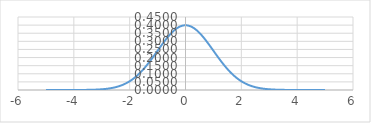
| Category | Series 0 |
|---|---|
| -5.0 | 0 |
| -4.9 | 0 |
| -4.8 | 0 |
| -4.7 | 0 |
| -4.6 | 0 |
| -4.5 | 0 |
| -4.4 | 0 |
| -4.3 | 0 |
| -4.2 | 0 |
| -4.1 | 0 |
| -4.0 | 0 |
| -3.9 | 0 |
| -3.8 | 0 |
| -3.7 | 0 |
| -3.6 | 0.001 |
| -3.50000000000001 | 0.001 |
| -3.40000000000001 | 0.001 |
| -3.30000000000001 | 0.002 |
| -3.20000000000001 | 0.002 |
| -3.10000000000001 | 0.003 |
| -3.00000000000001 | 0.004 |
| -2.90000000000001 | 0.006 |
| -2.80000000000001 | 0.008 |
| -2.70000000000001 | 0.01 |
| -2.60000000000001 | 0.014 |
| -2.50000000000001 | 0.018 |
| -2.40000000000001 | 0.022 |
| -2.30000000000001 | 0.028 |
| -2.20000000000001 | 0.035 |
| -2.10000000000001 | 0.044 |
| -2.00000000000001 | 0.054 |
| -1.90000000000001 | 0.066 |
| -1.80000000000001 | 0.079 |
| -1.70000000000001 | 0.094 |
| -1.60000000000001 | 0.111 |
| -1.50000000000001 | 0.13 |
| -1.40000000000001 | 0.15 |
| -1.30000000000001 | 0.171 |
| -1.20000000000001 | 0.194 |
| -1.10000000000001 | 0.218 |
| -1.00000000000001 | 0.242 |
| -0.90000000000001 | 0.266 |
| -0.80000000000001 | 0.29 |
| -0.70000000000002 | 0.312 |
| -0.60000000000002 | 0.333 |
| -0.50000000000002 | 0.352 |
| -0.40000000000002 | 0.368 |
| -0.30000000000002 | 0.381 |
| -0.20000000000002 | 0.391 |
| -0.10000000000002 | 0.397 |
| -2.04281036531029e-14 | 0.399 |
| 0.0999999999999801 | 0.397 |
| 0.19999999999998 | 0.391 |
| 0.29999999999998 | 0.381 |
| 0.39999999999998 | 0.368 |
| 0.49999999999998 | 0.352 |
| 0.59999999999998 | 0.333 |
| 0.69999999999998 | 0.312 |
| 0.79999999999998 | 0.29 |
| 0.89999999999998 | 0.266 |
| 0.99999999999998 | 0.242 |
| 1.09999999999998 | 0.218 |
| 1.19999999999998 | 0.194 |
| 1.29999999999998 | 0.171 |
| 1.39999999999998 | 0.15 |
| 1.49999999999998 | 0.13 |
| 1.59999999999998 | 0.111 |
| 1.69999999999998 | 0.094 |
| 1.79999999999998 | 0.079 |
| 1.89999999999998 | 0.066 |
| 1.99999999999998 | 0.054 |
| 2.09999999999997 | 0.044 |
| 2.19999999999997 | 0.035 |
| 2.29999999999997 | 0.028 |
| 2.39999999999997 | 0.022 |
| 2.49999999999997 | 0.018 |
| 2.59999999999997 | 0.014 |
| 2.69999999999997 | 0.01 |
| 2.79999999999997 | 0.008 |
| 2.89999999999997 | 0.006 |
| 2.99999999999997 | 0.004 |
| 3.09999999999997 | 0.003 |
| 3.19999999999997 | 0.002 |
| 3.29999999999997 | 0.002 |
| 3.39999999999997 | 0.001 |
| 3.49999999999997 | 0.001 |
| 3.59999999999997 | 0.001 |
| 3.69999999999997 | 0 |
| 3.79999999999997 | 0 |
| 3.89999999999997 | 0 |
| 3.99999999999997 | 0 |
| 4.09999999999997 | 0 |
| 4.19999999999997 | 0 |
| 4.29999999999997 | 0 |
| 4.39999999999997 | 0 |
| 4.49999999999997 | 0 |
| 4.59999999999997 | 0 |
| 4.69999999999997 | 0 |
| 4.79999999999997 | 0 |
| 4.89999999999996 | 0 |
| 4.99999999999996 | 0 |